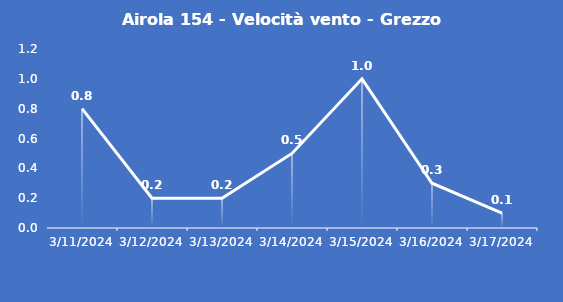
| Category | Airola 154 - Velocità vento - Grezzo (m/s) |
|---|---|
| 3/11/24 | 0.8 |
| 3/12/24 | 0.2 |
| 3/13/24 | 0.2 |
| 3/14/24 | 0.5 |
| 3/15/24 | 1 |
| 3/16/24 | 0.3 |
| 3/17/24 | 0.1 |